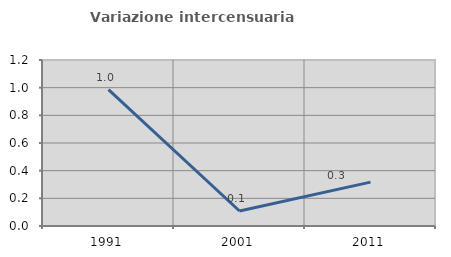
| Category | Variazione intercensuaria annua |
|---|---|
| 1991.0 | 0.986 |
| 2001.0 | 0.108 |
| 2011.0 | 0.317 |